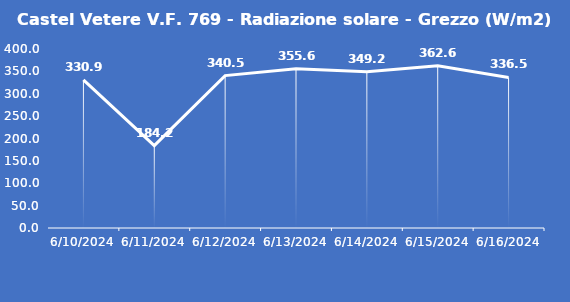
| Category | Castel Vetere V.F. 769 - Radiazione solare - Grezzo (W/m2) |
|---|---|
| 6/10/24 | 330.9 |
| 6/11/24 | 184.2 |
| 6/12/24 | 340.5 |
| 6/13/24 | 355.6 |
| 6/14/24 | 349.2 |
| 6/15/24 | 362.6 |
| 6/16/24 | 336.5 |